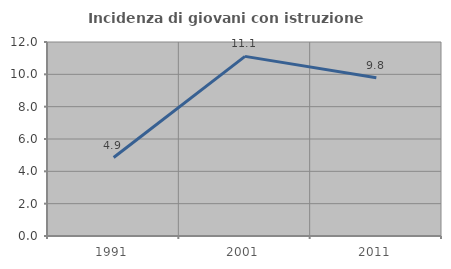
| Category | Incidenza di giovani con istruzione universitaria |
|---|---|
| 1991.0 | 4.854 |
| 2001.0 | 11.111 |
| 2011.0 | 9.783 |